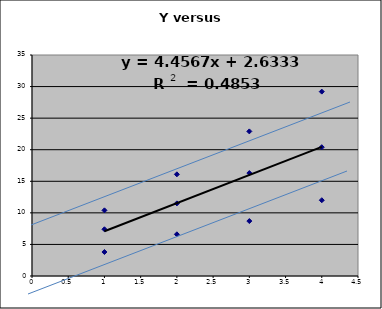
| Category | Y |
|---|---|
| 1.0 | 3.8 |
| 2.0 | 6.6 |
| 3.0 | 8.7 |
| 4.0 | 12 |
| 1.0 | 7.4 |
| 2.0 | 11.5 |
| 3.0 | 16.3 |
| 4.0 | 20.4 |
| 1.0 | 10.4 |
| 2.0 | 16.1 |
| 3.0 | 22.9 |
| 4.0 | 29.2 |